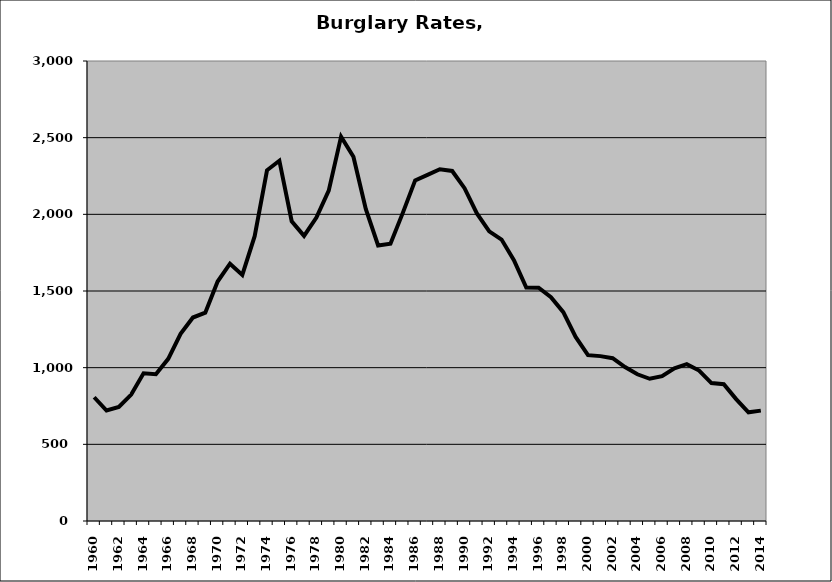
| Category | Burglary |
|---|---|
| 1960.0 | 807.14 |
| 1961.0 | 720.548 |
| 1962.0 | 743.268 |
| 1963.0 | 824.558 |
| 1964.0 | 963.348 |
| 1965.0 | 957.037 |
| 1966.0 | 1057.718 |
| 1967.0 | 1220.817 |
| 1968.0 | 1326.997 |
| 1969.0 | 1358.325 |
| 1970.0 | 1561.778 |
| 1971.0 | 1678.384 |
| 1972.0 | 1605.125 |
| 1973.0 | 1857.215 |
| 1974.0 | 2287.293 |
| 1975.0 | 2349.623 |
| 1976.0 | 1954.744 |
| 1977.0 | 1859.856 |
| 1978.0 | 1978.834 |
| 1979.0 | 2154.447 |
| 1980.0 | 2506.765 |
| 1981.0 | 2375.92 |
| 1982.0 | 2034.677 |
| 1983.0 | 1796.835 |
| 1984.0 | 1807.999 |
| 1985.0 | 2009.52 |
| 1986.0 | 2221.251 |
| 1987.0 | 2256.891 |
| 1988.0 | 2294.255 |
| 1989.0 | 2282.803 |
| 1990.0 | 2170.611 |
| 1991.0 | 2005.822 |
| 1992.0 | 1888.753 |
| 1993.0 | 1835.39 |
| 1994.0 | 1701.003 |
| 1995.0 | 1522.356 |
| 1996.0 | 1521.222 |
| 1997.0 | 1459.847 |
| 1998.0 | 1361.659 |
| 1999.0 | 1200.285 |
| 2000.0 | 1081.804 |
| 2001.0 | 1075.236 |
| 2002.0 | 1061.857 |
| 2003.0 | 1003.837 |
| 2004.0 | 956.732 |
| 2005.0 | 927.404 |
| 2006.0 | 944.577 |
| 2007.0 | 996.343 |
| 2008.0 | 1022.993 |
| 2009.0 | 981.143 |
| 2010.0 | 899.506 |
| 2011.0 | 891.776 |
| 2012.0 | 794.809 |
| 2013.0 | 708.739 |
| 2014.0 | 719.941 |